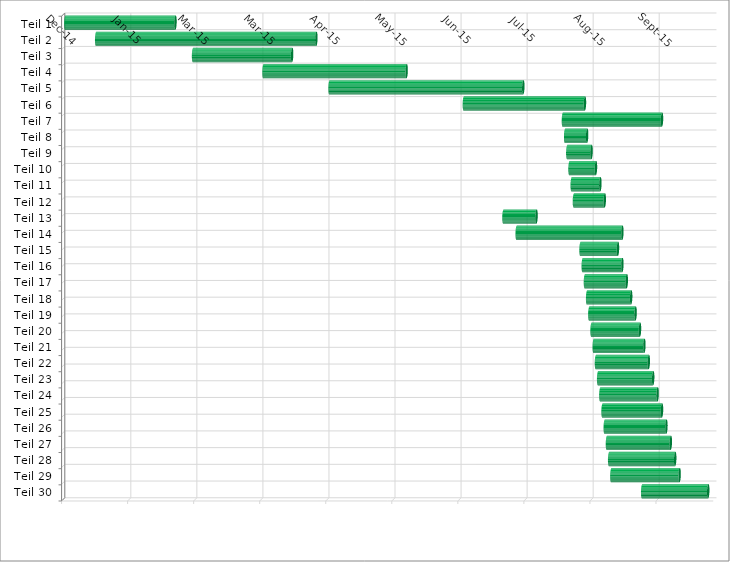
| Category | Beginn | Ende |
|---|---|---|
| Teil 1 | 1/1/15 | 50 |
| Teil 2 | 1/15/15 | 100 |
| Teil 3 | 2/28/15 | 45 |
| Teil 4 | 4/1/15 | 65 |
| Teil 5 | 5/1/15 | 88 |
| Teil 6 | 7/1/15 | 55 |
| Teil 7 | 8/15/15 | 45 |
| Teil 8 | 8/16/15 | 10 |
| Teil 9 | 8/17/15 | 11 |
| Teil 10 | 8/18/15 | 12 |
| Teil 11 | 8/19/15 | 13 |
| Teil 12 | 8/20/15 | 14 |
| Teil 13 | 7/19/15 | 15 |
| Teil 14 | 7/25/15 | 48 |
| Teil 15 | 8/23/15 | 17 |
| Teil 16 | 8/24/15 | 18 |
| Teil 17 | 8/25/15 | 19 |
| Teil 18 | 8/26/15 | 20 |
| Teil 19 | 8/27/15 | 21 |
| Teil 20 | 8/28/15 | 22 |
| Teil 21 | 8/29/15 | 23 |
| Teil 22 | 8/30/15 | 24 |
| Teil 23 | 8/31/15 | 25 |
| Teil 24 | 9/1/15 | 26 |
| Teil 25 | 9/2/15 | 27 |
| Teil 26 | 9/3/15 | 28 |
| Teil 27 | 9/4/15 | 29 |
| Teil 28 | 9/5/15 | 30 |
| Teil 29 | 9/6/15 | 31 |
| Teil 30 | 9/20/15 | 30 |